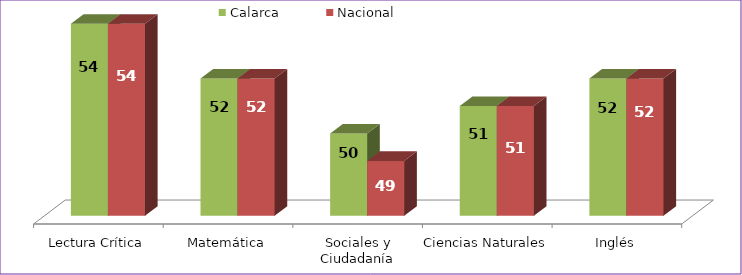
| Category | Calarca | Nacional |
|---|---|---|
| Lectura Crítica | 54 | 54 |
| Matemática | 52 | 52 |
| Sociales y Ciudadanía | 50 | 49 |
| Ciencias Naturales | 51 | 51 |
| Inglés | 52 | 52 |